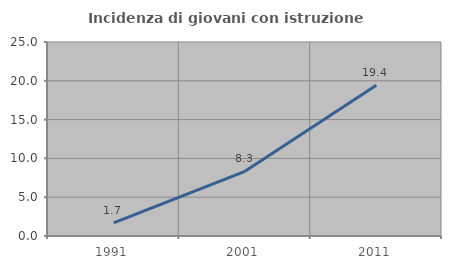
| Category | Incidenza di giovani con istruzione universitaria |
|---|---|
| 1991.0 | 1.695 |
| 2001.0 | 8.333 |
| 2011.0 | 19.417 |